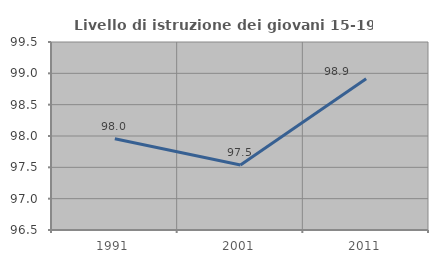
| Category | Livello di istruzione dei giovani 15-19 anni |
|---|---|
| 1991.0 | 97.956 |
| 2001.0 | 97.538 |
| 2011.0 | 98.913 |